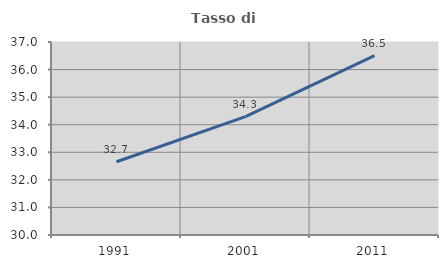
| Category | Tasso di occupazione   |
|---|---|
| 1991.0 | 32.658 |
| 2001.0 | 34.292 |
| 2011.0 | 36.509 |